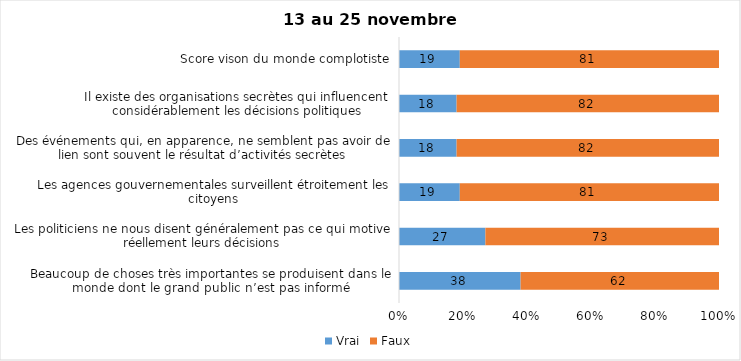
| Category | Vrai | Faux |
|---|---|---|
| Beaucoup de choses très importantes se produisent dans le monde dont le grand public n’est pas informé | 38 | 62 |
| Les politiciens ne nous disent généralement pas ce qui motive réellement leurs décisions | 27 | 73 |
| Les agences gouvernementales surveillent étroitement les citoyens | 19 | 81 |
| Des événements qui, en apparence, ne semblent pas avoir de lien sont souvent le résultat d’activités secrètes | 18 | 82 |
| Il existe des organisations secrètes qui influencent considérablement les décisions politiques | 18 | 82 |
| Score vison du monde complotiste | 19 | 81 |